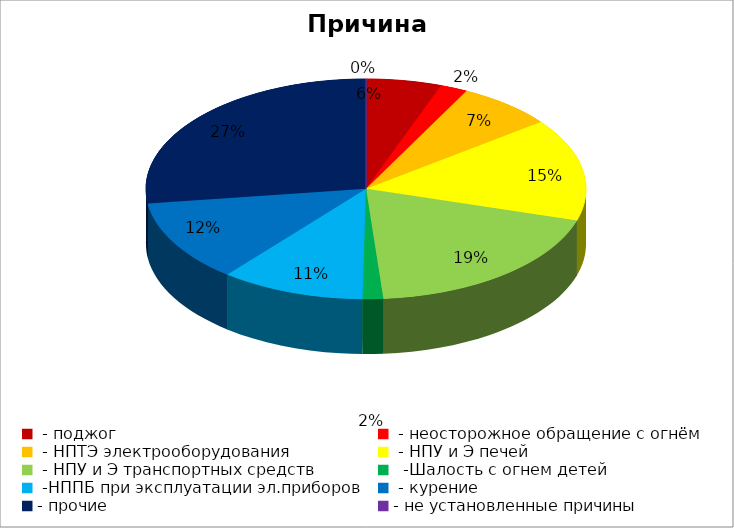
| Category | Причина пожара |
|---|---|
|  - поджог | 11 |
|  - неосторожное обращение с огнём | 4 |
|  - НПТЭ электрооборудования | 14 |
|  - НПУ и Э печей | 30 |
|  - НПУ и Э транспортных средств | 38 |
|   -Шалость с огнем детей | 3 |
|  -НППБ при эксплуатации эл.приборов | 21 |
|  - курение | 24 |
| - прочие | 54 |
| - не установленные причины | 0 |